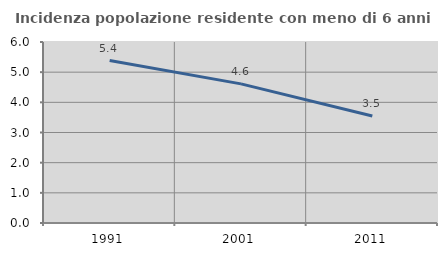
| Category | Incidenza popolazione residente con meno di 6 anni |
|---|---|
| 1991.0 | 5.385 |
| 2001.0 | 4.613 |
| 2011.0 | 3.546 |